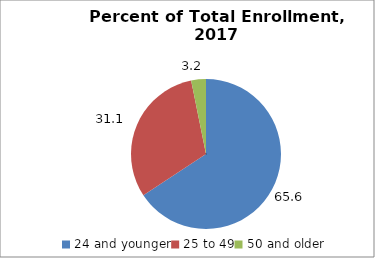
| Category | Series 0 |
|---|---|
| 24 and younger | 65.622 |
| 25 to 49 | 31.054 |
| 50 and older | 3.171 |